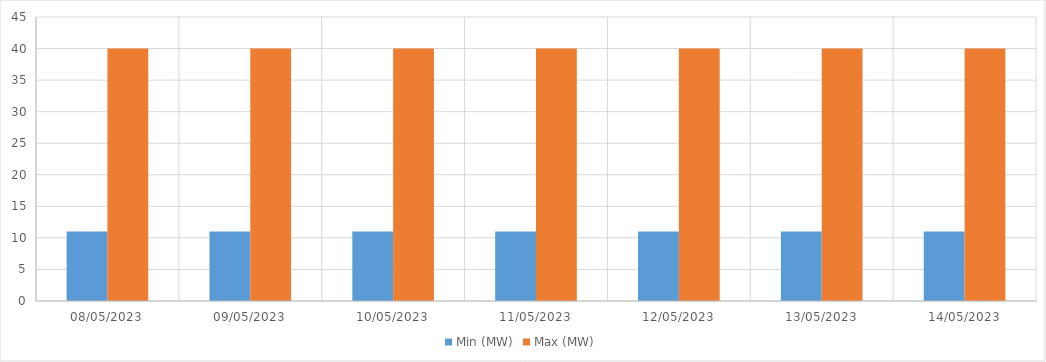
| Category | Min (MW) | Max (MW) |
|---|---|---|
| 08/05/2023 | 11 | 40 |
| 09/05/2023 | 11 | 40 |
| 10/05/2023 | 11 | 40 |
| 11/05/2023 | 11 | 40 |
| 12/05/2023 | 11 | 40 |
| 13/05/2023 | 11 | 40 |
| 14/05/2023 | 11 | 40 |